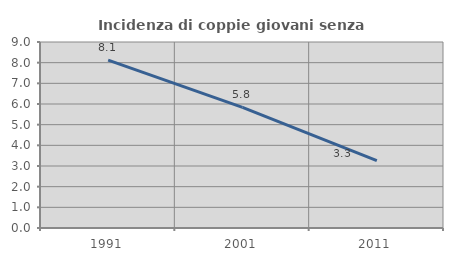
| Category | Incidenza di coppie giovani senza figli |
|---|---|
| 1991.0 | 8.12 |
| 2001.0 | 5.839 |
| 2011.0 | 3.257 |